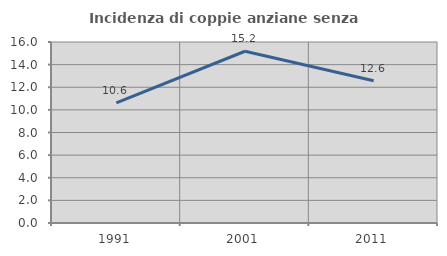
| Category | Incidenza di coppie anziane senza figli  |
|---|---|
| 1991.0 | 10.628 |
| 2001.0 | 15.183 |
| 2011.0 | 12.575 |